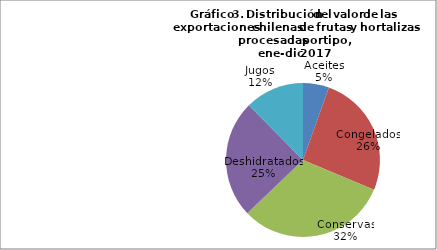
| Category | Series 0 |
|---|---|
| Aceites | 78903396.58 |
| Congelados | 373627645.01 |
| Conservas | 455709924.46 |
| Deshidratados | 357634300.29 |
| Jugos | 178902202.11 |